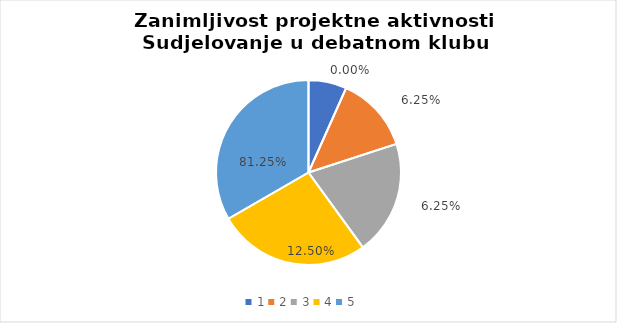
| Category | Series 0 | Series 1 |
|---|---|---|
| 0 | 1 | 0 |
| 1 | 2 | 0.062 |
| 2 | 3 | 0.062 |
| 3 | 4 | 0.125 |
| 4 | 5 | 0.812 |